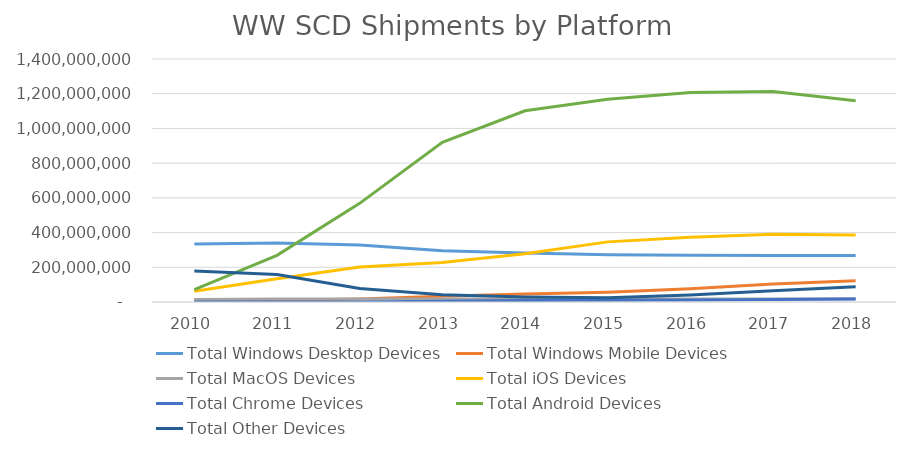
| Category | Total Windows Desktop Devices | Total Windows Mobile Devices | Total MacOS Devices | Total iOS Devices | Total Chrome Devices | Total Android Devices | Total Other Devices |
|---|---|---|---|---|---|---|---|
| 2010.0 | 333905338 | 14215765 | 14640925 | 62301913 | 0 | 71034002 | 178185521 |
| 2011.0 | 339747111 | 9297844 | 17696617 | 133651169 | 0 | 268900689 | 158257731 |
| 2012.0 | 328225780 | 16939705 | 17045087 | 201586983 | 0 | 568382388 | 77842995 |
| 2013.0 | 295184932 | 33664647 | 16760435 | 227636663 | 4640629 | 920384655 | 42147613 |
| 2014.0 | 282014233 | 45410813 | 17302224 | 278576393 | 8960253 | 1101720046 | 29227750 |
| 2015.0 | 272549095 | 56583554 | 17049068 | 346413544 | 9653831 | 1167521743 | 25105952 |
| 2016.0 | 269024136 | 77036686 | 17270855 | 373544610 | 11589400 | 1207034995 | 40666566 |
| 2017.0 | 267576142 | 103557894 | 17992151 | 389643528 | 14121251 | 1212643004 | 64818508 |
| 2018.0 | 268059808 | 122670173 | 19065567 | 386223897 | 17475041 | 1159351734 | 88391719 |